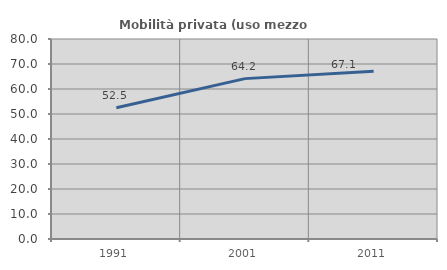
| Category | Mobilità privata (uso mezzo privato) |
|---|---|
| 1991.0 | 52.5 |
| 2001.0 | 64.151 |
| 2011.0 | 67.104 |